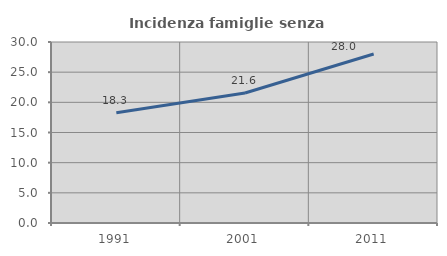
| Category | Incidenza famiglie senza nuclei |
|---|---|
| 1991.0 | 18.278 |
| 2001.0 | 21.553 |
| 2011.0 | 28.012 |